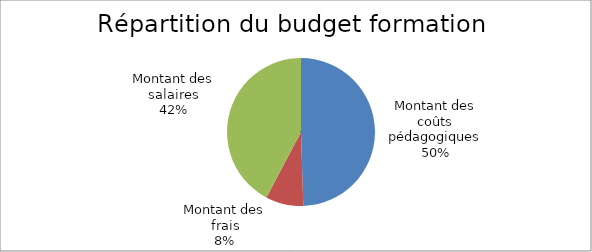
| Category | TOTAL |
|---|---|
| Montant des coûts pédagogiques | 15000 |
| Montant des frais | 2500 |
| Montant des salaires | 12800 |